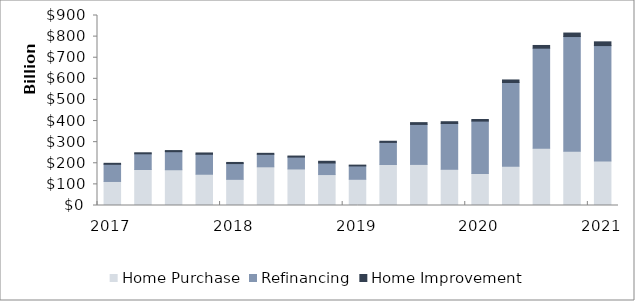
| Category | Filing Quarter | Home Purchase | Refinancing | Home Improvement |
|---|---|---|---|---|
| 2017 |  | 113829634250 | 81359069638 | 4651062407 |
| 2017 |  | 170444454197 | 74433630979 | 4887766339 |
| 2017 |  | 169392462027 | 85416781862 | 5370310177 |
| 2017 |  | 148104038533 | 94622483848 | 6168449784 |
| 2018 |  | 123918265027 | 74690371787 | 5301523310 |
| 2018 |  | 183305206616 | 59053391038 | 4783614107 |
| 2018 |  | 173035680065 | 56269972282 | 4971421243 |
| 2018 |  | 146582947480 | 54748609396 | 8157899656 |
| 2019 |  | 124167950342 | 63182176214 | 3940300862 |
| 2019 |  | 194165734913 | 104681554361 | 5528693711 |
| 2019 |  | 194639578095 | 189452558848 | 8448404744 |
| 2019 |  | 171551074117 | 216939361644 | 8414012092 |
| 2020 |  | 150988832789 | 248729398652 | 7766396266 |
| 2020 |  | 185916863906 | 396695380674 | 12056247498 |
| 2020 |  | 271224387344 | 473957807417 | 12866435515 |
| 2020 |  | 257471058288 | 542862446480 | 16593885847 |
| 2021 |  | 210468005769 | 547035482419 | 17714875126 |